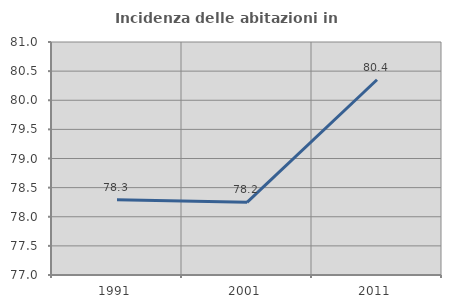
| Category | Incidenza delle abitazioni in proprietà  |
|---|---|
| 1991.0 | 78.291 |
| 2001.0 | 78.247 |
| 2011.0 | 80.351 |